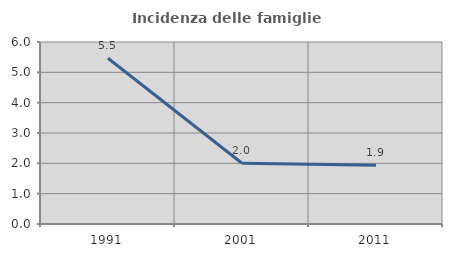
| Category | Incidenza delle famiglie numerose |
|---|---|
| 1991.0 | 5.464 |
| 2001.0 | 2.004 |
| 2011.0 | 1.934 |